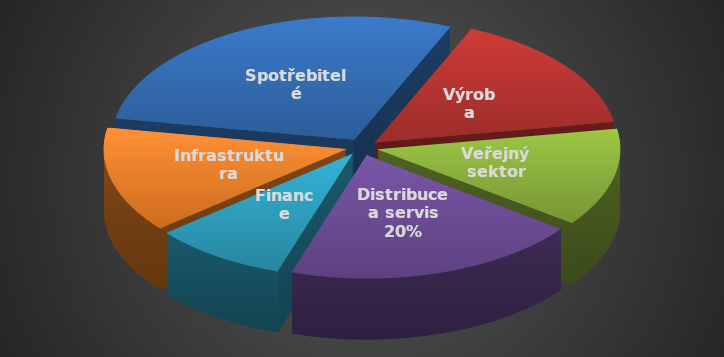
| Category | Series 0 |
|---|---|
| Spotřebitelé | 29 |
| Výroba | 16 |
| Veřejný sektor | 13 |
| Distribuce a servis | 20 |
| Finance | 9 |
| Infrastruktura | 14 |